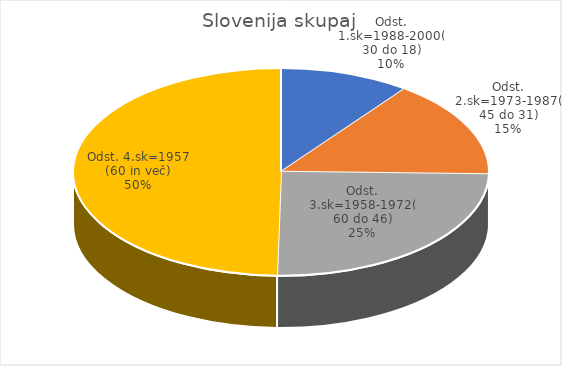
| Category | Slovenija skupaj |
|---|---|
| Odst. 1.sk=1988-2000(30 do 18) | 1.52 |
| Odst. 2.sk=1973-1987(45 do 31) | 2.27 |
| Odst. 3.sk=1958-1972(60 do 46) | 3.73 |
| Odst. 4.sk=1957 (60 in več) | 7.43 |